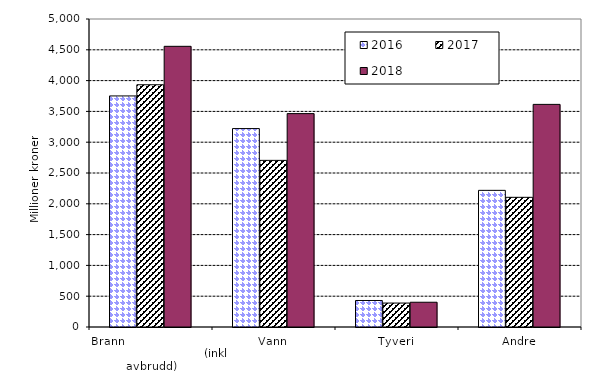
| Category | 2016 | 2017 | 2018 |
|---|---|---|---|
| Brann                                                       (inkl avbrudd) | 3751.149 | 3932.502 | 4556.418 |
| Vann | 3221.145 | 2705.058 | 3463.98 |
| Tyveri | 430.36 | 388.618 | 401.889 |
| Andre | 2218.392 | 2105.272 | 3613.977 |